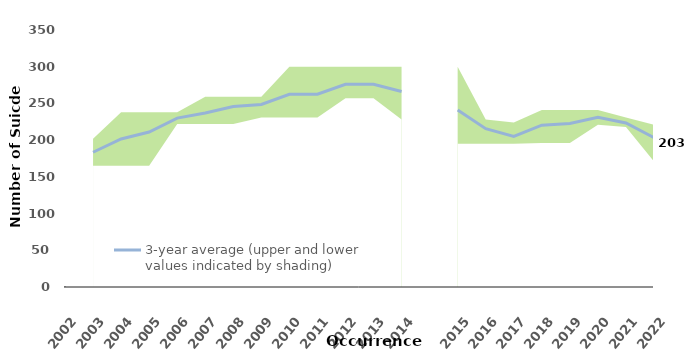
| Category | 3-year average (upper and lower
values indicated by shading) | #REF! |
|---|---|---|
| 0 |  | 1 |